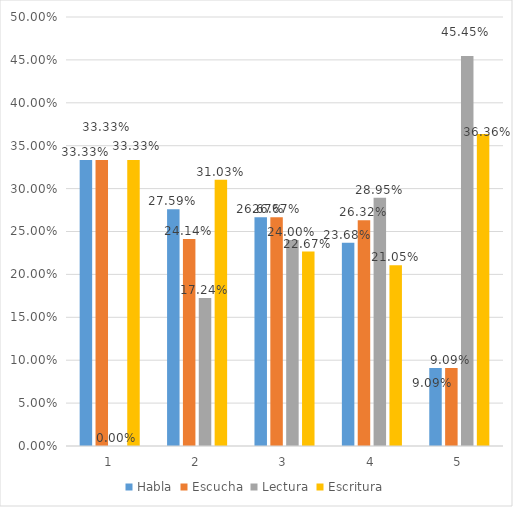
| Category | Habla | Escucha | Lectura | Escritura |
|---|---|---|---|---|
| 0 | 0.333 | 0.333 | 0 | 0.333 |
| 1 | 0.276 | 0.241 | 0.172 | 0.31 |
| 2 | 0.267 | 0.267 | 0.24 | 0.227 |
| 3 | 0.237 | 0.263 | 0.289 | 0.211 |
| 4 | 0.091 | 0.091 | 0.455 | 0.364 |